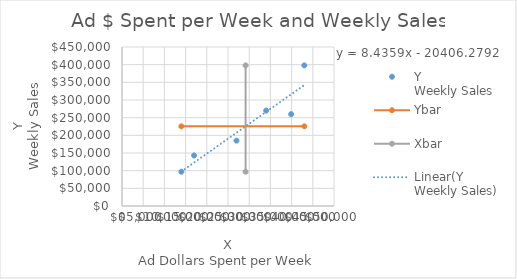
| Category | Y
Weekly Sales |
|---|---|
| 14000.0 | 97000 |
| 27000.0 | 185000 |
| 39900.0 | 260000 |
| 17000.0 | 143000 |
| 34000.0 | 270000 |
| 43000.0 | 398000 |